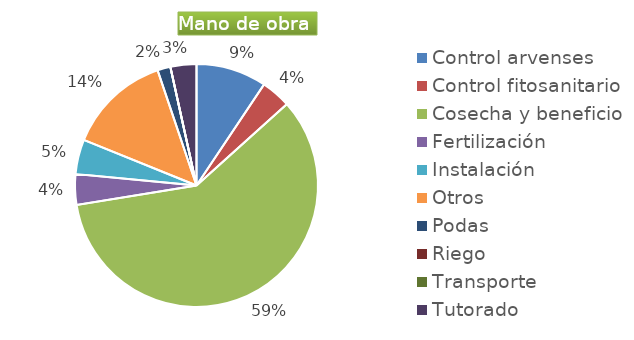
| Category | Series 0 |
|---|---|
| Control arvenses | 5320000 |
| Control fitosanitario | 2240000 |
| Cosecha y beneficio | 33530000 |
| Fertilización | 2310000 |
| Instalación | 2612728 |
| Otros | 7770000 |
| Podas | 980000 |
| Riego | 0 |
| Transporte | 0 |
| Tutorado | 1960000 |